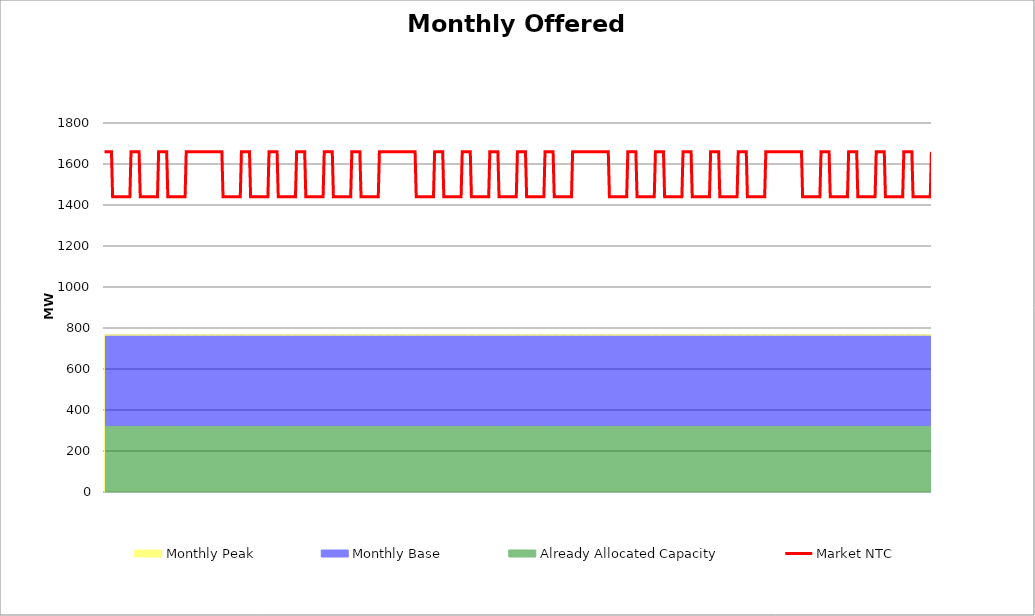
| Category | Market NTC |
|---|---|
| 0 | 1660 |
| 1 | 1660 |
| 2 | 1660 |
| 3 | 1660 |
| 4 | 1660 |
| 5 | 1660 |
| 6 | 1660 |
| 7 | 1440 |
| 8 | 1440 |
| 9 | 1440 |
| 10 | 1440 |
| 11 | 1440 |
| 12 | 1440 |
| 13 | 1440 |
| 14 | 1440 |
| 15 | 1440 |
| 16 | 1440 |
| 17 | 1440 |
| 18 | 1440 |
| 19 | 1440 |
| 20 | 1440 |
| 21 | 1440 |
| 22 | 1440 |
| 23 | 1660 |
| 24 | 1660 |
| 25 | 1660 |
| 26 | 1660 |
| 27 | 1660 |
| 28 | 1660 |
| 29 | 1660 |
| 30 | 1660 |
| 31 | 1440 |
| 32 | 1440 |
| 33 | 1440 |
| 34 | 1440 |
| 35 | 1440 |
| 36 | 1440 |
| 37 | 1440 |
| 38 | 1440 |
| 39 | 1440 |
| 40 | 1440 |
| 41 | 1440 |
| 42 | 1440 |
| 43 | 1440 |
| 44 | 1440 |
| 45 | 1440 |
| 46 | 1440 |
| 47 | 1660 |
| 48 | 1660 |
| 49 | 1660 |
| 50 | 1660 |
| 51 | 1660 |
| 52 | 1660 |
| 53 | 1660 |
| 54 | 1660 |
| 55 | 1440 |
| 56 | 1440 |
| 57 | 1440 |
| 58 | 1440 |
| 59 | 1440 |
| 60 | 1440 |
| 61 | 1440 |
| 62 | 1440 |
| 63 | 1440 |
| 64 | 1440 |
| 65 | 1440 |
| 66 | 1440 |
| 67 | 1440 |
| 68 | 1440 |
| 69 | 1440 |
| 70 | 1440 |
| 71 | 1660 |
| 72 | 1660 |
| 73 | 1660 |
| 74 | 1660 |
| 75 | 1660 |
| 76 | 1660 |
| 77 | 1660 |
| 78 | 1660 |
| 79 | 1660 |
| 80 | 1660 |
| 81 | 1660 |
| 82 | 1660 |
| 83 | 1660 |
| 84 | 1660 |
| 85 | 1660 |
| 86 | 1660 |
| 87 | 1660 |
| 88 | 1660 |
| 89 | 1660 |
| 90 | 1660 |
| 91 | 1660 |
| 92 | 1660 |
| 93 | 1660 |
| 94 | 1660 |
| 95 | 1660 |
| 96 | 1660 |
| 97 | 1660 |
| 98 | 1660 |
| 99 | 1660 |
| 100 | 1660 |
| 101 | 1660 |
| 102 | 1660 |
| 103 | 1440 |
| 104 | 1440 |
| 105 | 1440 |
| 106 | 1440 |
| 107 | 1440 |
| 108 | 1440 |
| 109 | 1440 |
| 110 | 1440 |
| 111 | 1440 |
| 112 | 1440 |
| 113 | 1440 |
| 114 | 1440 |
| 115 | 1440 |
| 116 | 1440 |
| 117 | 1440 |
| 118 | 1440 |
| 119 | 1660 |
| 120 | 1660 |
| 121 | 1660 |
| 122 | 1660 |
| 123 | 1660 |
| 124 | 1660 |
| 125 | 1660 |
| 126 | 1660 |
| 127 | 1440 |
| 128 | 1440 |
| 129 | 1440 |
| 130 | 1440 |
| 131 | 1440 |
| 132 | 1440 |
| 133 | 1440 |
| 134 | 1440 |
| 135 | 1440 |
| 136 | 1440 |
| 137 | 1440 |
| 138 | 1440 |
| 139 | 1440 |
| 140 | 1440 |
| 141 | 1440 |
| 142 | 1440 |
| 143 | 1660 |
| 144 | 1660 |
| 145 | 1660 |
| 146 | 1660 |
| 147 | 1660 |
| 148 | 1660 |
| 149 | 1660 |
| 150 | 1660 |
| 151 | 1440 |
| 152 | 1440 |
| 153 | 1440 |
| 154 | 1440 |
| 155 | 1440 |
| 156 | 1440 |
| 157 | 1440 |
| 158 | 1440 |
| 159 | 1440 |
| 160 | 1440 |
| 161 | 1440 |
| 162 | 1440 |
| 163 | 1440 |
| 164 | 1440 |
| 165 | 1440 |
| 166 | 1440 |
| 167 | 1660 |
| 168 | 1660 |
| 169 | 1660 |
| 170 | 1660 |
| 171 | 1660 |
| 172 | 1660 |
| 173 | 1660 |
| 174 | 1660 |
| 175 | 1440 |
| 176 | 1440 |
| 177 | 1440 |
| 178 | 1440 |
| 179 | 1440 |
| 180 | 1440 |
| 181 | 1440 |
| 182 | 1440 |
| 183 | 1440 |
| 184 | 1440 |
| 185 | 1440 |
| 186 | 1440 |
| 187 | 1440 |
| 188 | 1440 |
| 189 | 1440 |
| 190 | 1440 |
| 191 | 1660 |
| 192 | 1660 |
| 193 | 1660 |
| 194 | 1660 |
| 195 | 1660 |
| 196 | 1660 |
| 197 | 1660 |
| 198 | 1660 |
| 199 | 1440 |
| 200 | 1440 |
| 201 | 1440 |
| 202 | 1440 |
| 203 | 1440 |
| 204 | 1440 |
| 205 | 1440 |
| 206 | 1440 |
| 207 | 1440 |
| 208 | 1440 |
| 209 | 1440 |
| 210 | 1440 |
| 211 | 1440 |
| 212 | 1440 |
| 213 | 1440 |
| 214 | 1440 |
| 215 | 1660 |
| 216 | 1660 |
| 217 | 1660 |
| 218 | 1660 |
| 219 | 1660 |
| 220 | 1660 |
| 221 | 1660 |
| 222 | 1660 |
| 223 | 1440 |
| 224 | 1440 |
| 225 | 1440 |
| 226 | 1440 |
| 227 | 1440 |
| 228 | 1440 |
| 229 | 1440 |
| 230 | 1440 |
| 231 | 1440 |
| 232 | 1440 |
| 233 | 1440 |
| 234 | 1440 |
| 235 | 1440 |
| 236 | 1440 |
| 237 | 1440 |
| 238 | 1440 |
| 239 | 1660 |
| 240 | 1660 |
| 241 | 1660 |
| 242 | 1660 |
| 243 | 1660 |
| 244 | 1660 |
| 245 | 1660 |
| 246 | 1660 |
| 247 | 1660 |
| 248 | 1660 |
| 249 | 1660 |
| 250 | 1660 |
| 251 | 1660 |
| 252 | 1660 |
| 253 | 1660 |
| 254 | 1660 |
| 255 | 1660 |
| 256 | 1660 |
| 257 | 1660 |
| 258 | 1660 |
| 259 | 1660 |
| 260 | 1660 |
| 261 | 1660 |
| 262 | 1660 |
| 263 | 1660 |
| 264 | 1660 |
| 265 | 1660 |
| 266 | 1660 |
| 267 | 1660 |
| 268 | 1660 |
| 269 | 1660 |
| 270 | 1660 |
| 271 | 1440 |
| 272 | 1440 |
| 273 | 1440 |
| 274 | 1440 |
| 275 | 1440 |
| 276 | 1440 |
| 277 | 1440 |
| 278 | 1440 |
| 279 | 1440 |
| 280 | 1440 |
| 281 | 1440 |
| 282 | 1440 |
| 283 | 1440 |
| 284 | 1440 |
| 285 | 1440 |
| 286 | 1440 |
| 287 | 1660 |
| 288 | 1660 |
| 289 | 1660 |
| 290 | 1660 |
| 291 | 1660 |
| 292 | 1660 |
| 293 | 1660 |
| 294 | 1660 |
| 295 | 1440 |
| 296 | 1440 |
| 297 | 1440 |
| 298 | 1440 |
| 299 | 1440 |
| 300 | 1440 |
| 301 | 1440 |
| 302 | 1440 |
| 303 | 1440 |
| 304 | 1440 |
| 305 | 1440 |
| 306 | 1440 |
| 307 | 1440 |
| 308 | 1440 |
| 309 | 1440 |
| 310 | 1440 |
| 311 | 1660 |
| 312 | 1660 |
| 313 | 1660 |
| 314 | 1660 |
| 315 | 1660 |
| 316 | 1660 |
| 317 | 1660 |
| 318 | 1660 |
| 319 | 1440 |
| 320 | 1440 |
| 321 | 1440 |
| 322 | 1440 |
| 323 | 1440 |
| 324 | 1440 |
| 325 | 1440 |
| 326 | 1440 |
| 327 | 1440 |
| 328 | 1440 |
| 329 | 1440 |
| 330 | 1440 |
| 331 | 1440 |
| 332 | 1440 |
| 333 | 1440 |
| 334 | 1440 |
| 335 | 1660 |
| 336 | 1660 |
| 337 | 1660 |
| 338 | 1660 |
| 339 | 1660 |
| 340 | 1660 |
| 341 | 1660 |
| 342 | 1660 |
| 343 | 1440 |
| 344 | 1440 |
| 345 | 1440 |
| 346 | 1440 |
| 347 | 1440 |
| 348 | 1440 |
| 349 | 1440 |
| 350 | 1440 |
| 351 | 1440 |
| 352 | 1440 |
| 353 | 1440 |
| 354 | 1440 |
| 355 | 1440 |
| 356 | 1440 |
| 357 | 1440 |
| 358 | 1440 |
| 359 | 1660 |
| 360 | 1660 |
| 361 | 1660 |
| 362 | 1660 |
| 363 | 1660 |
| 364 | 1660 |
| 365 | 1660 |
| 366 | 1660 |
| 367 | 1440 |
| 368 | 1440 |
| 369 | 1440 |
| 370 | 1440 |
| 371 | 1440 |
| 372 | 1440 |
| 373 | 1440 |
| 374 | 1440 |
| 375 | 1440 |
| 376 | 1440 |
| 377 | 1440 |
| 378 | 1440 |
| 379 | 1440 |
| 380 | 1440 |
| 381 | 1440 |
| 382 | 1440 |
| 383 | 1660 |
| 384 | 1660 |
| 385 | 1660 |
| 386 | 1660 |
| 387 | 1660 |
| 388 | 1660 |
| 389 | 1660 |
| 390 | 1660 |
| 391 | 1440 |
| 392 | 1440 |
| 393 | 1440 |
| 394 | 1440 |
| 395 | 1440 |
| 396 | 1440 |
| 397 | 1440 |
| 398 | 1440 |
| 399 | 1440 |
| 400 | 1440 |
| 401 | 1440 |
| 402 | 1440 |
| 403 | 1440 |
| 404 | 1440 |
| 405 | 1440 |
| 406 | 1440 |
| 407 | 1660 |
| 408 | 1660 |
| 409 | 1660 |
| 410 | 1660 |
| 411 | 1660 |
| 412 | 1660 |
| 413 | 1660 |
| 414 | 1660 |
| 415 | 1660 |
| 416 | 1660 |
| 417 | 1660 |
| 418 | 1660 |
| 419 | 1660 |
| 420 | 1660 |
| 421 | 1660 |
| 422 | 1660 |
| 423 | 1660 |
| 424 | 1660 |
| 425 | 1660 |
| 426 | 1660 |
| 427 | 1660 |
| 428 | 1660 |
| 429 | 1660 |
| 430 | 1660 |
| 431 | 1660 |
| 432 | 1660 |
| 433 | 1660 |
| 434 | 1660 |
| 435 | 1660 |
| 436 | 1660 |
| 437 | 1660 |
| 438 | 1660 |
| 439 | 1440 |
| 440 | 1440 |
| 441 | 1440 |
| 442 | 1440 |
| 443 | 1440 |
| 444 | 1440 |
| 445 | 1440 |
| 446 | 1440 |
| 447 | 1440 |
| 448 | 1440 |
| 449 | 1440 |
| 450 | 1440 |
| 451 | 1440 |
| 452 | 1440 |
| 453 | 1440 |
| 454 | 1440 |
| 455 | 1660 |
| 456 | 1660 |
| 457 | 1660 |
| 458 | 1660 |
| 459 | 1660 |
| 460 | 1660 |
| 461 | 1660 |
| 462 | 1660 |
| 463 | 1440 |
| 464 | 1440 |
| 465 | 1440 |
| 466 | 1440 |
| 467 | 1440 |
| 468 | 1440 |
| 469 | 1440 |
| 470 | 1440 |
| 471 | 1440 |
| 472 | 1440 |
| 473 | 1440 |
| 474 | 1440 |
| 475 | 1440 |
| 476 | 1440 |
| 477 | 1440 |
| 478 | 1440 |
| 479 | 1660 |
| 480 | 1660 |
| 481 | 1660 |
| 482 | 1660 |
| 483 | 1660 |
| 484 | 1660 |
| 485 | 1660 |
| 486 | 1660 |
| 487 | 1440 |
| 488 | 1440 |
| 489 | 1440 |
| 490 | 1440 |
| 491 | 1440 |
| 492 | 1440 |
| 493 | 1440 |
| 494 | 1440 |
| 495 | 1440 |
| 496 | 1440 |
| 497 | 1440 |
| 498 | 1440 |
| 499 | 1440 |
| 500 | 1440 |
| 501 | 1440 |
| 502 | 1440 |
| 503 | 1660 |
| 504 | 1660 |
| 505 | 1660 |
| 506 | 1660 |
| 507 | 1660 |
| 508 | 1660 |
| 509 | 1660 |
| 510 | 1660 |
| 511 | 1440 |
| 512 | 1440 |
| 513 | 1440 |
| 514 | 1440 |
| 515 | 1440 |
| 516 | 1440 |
| 517 | 1440 |
| 518 | 1440 |
| 519 | 1440 |
| 520 | 1440 |
| 521 | 1440 |
| 522 | 1440 |
| 523 | 1440 |
| 524 | 1440 |
| 525 | 1440 |
| 526 | 1440 |
| 527 | 1660 |
| 528 | 1660 |
| 529 | 1660 |
| 530 | 1660 |
| 531 | 1660 |
| 532 | 1660 |
| 533 | 1660 |
| 534 | 1660 |
| 535 | 1440 |
| 536 | 1440 |
| 537 | 1440 |
| 538 | 1440 |
| 539 | 1440 |
| 540 | 1440 |
| 541 | 1440 |
| 542 | 1440 |
| 543 | 1440 |
| 544 | 1440 |
| 545 | 1440 |
| 546 | 1440 |
| 547 | 1440 |
| 548 | 1440 |
| 549 | 1440 |
| 550 | 1440 |
| 551 | 1660 |
| 552 | 1660 |
| 553 | 1660 |
| 554 | 1660 |
| 555 | 1660 |
| 556 | 1660 |
| 557 | 1660 |
| 558 | 1660 |
| 559 | 1440 |
| 560 | 1440 |
| 561 | 1440 |
| 562 | 1440 |
| 563 | 1440 |
| 564 | 1440 |
| 565 | 1440 |
| 566 | 1440 |
| 567 | 1440 |
| 568 | 1440 |
| 569 | 1440 |
| 570 | 1440 |
| 571 | 1440 |
| 572 | 1440 |
| 573 | 1440 |
| 574 | 1440 |
| 575 | 1660 |
| 576 | 1660 |
| 577 | 1660 |
| 578 | 1660 |
| 579 | 1660 |
| 580 | 1660 |
| 581 | 1660 |
| 582 | 1660 |
| 583 | 1660 |
| 584 | 1660 |
| 585 | 1660 |
| 586 | 1660 |
| 587 | 1660 |
| 588 | 1660 |
| 589 | 1660 |
| 590 | 1660 |
| 591 | 1660 |
| 592 | 1660 |
| 593 | 1660 |
| 594 | 1660 |
| 595 | 1660 |
| 596 | 1660 |
| 597 | 1660 |
| 598 | 1660 |
| 599 | 1660 |
| 600 | 1660 |
| 601 | 1660 |
| 602 | 1660 |
| 603 | 1660 |
| 604 | 1660 |
| 605 | 1660 |
| 606 | 1660 |
| 607 | 1440 |
| 608 | 1440 |
| 609 | 1440 |
| 610 | 1440 |
| 611 | 1440 |
| 612 | 1440 |
| 613 | 1440 |
| 614 | 1440 |
| 615 | 1440 |
| 616 | 1440 |
| 617 | 1440 |
| 618 | 1440 |
| 619 | 1440 |
| 620 | 1440 |
| 621 | 1440 |
| 622 | 1440 |
| 623 | 1660 |
| 624 | 1660 |
| 625 | 1660 |
| 626 | 1660 |
| 627 | 1660 |
| 628 | 1660 |
| 629 | 1660 |
| 630 | 1660 |
| 631 | 1440 |
| 632 | 1440 |
| 633 | 1440 |
| 634 | 1440 |
| 635 | 1440 |
| 636 | 1440 |
| 637 | 1440 |
| 638 | 1440 |
| 639 | 1440 |
| 640 | 1440 |
| 641 | 1440 |
| 642 | 1440 |
| 643 | 1440 |
| 644 | 1440 |
| 645 | 1440 |
| 646 | 1440 |
| 647 | 1660 |
| 648 | 1660 |
| 649 | 1660 |
| 650 | 1660 |
| 651 | 1660 |
| 652 | 1660 |
| 653 | 1660 |
| 654 | 1660 |
| 655 | 1440 |
| 656 | 1440 |
| 657 | 1440 |
| 658 | 1440 |
| 659 | 1440 |
| 660 | 1440 |
| 661 | 1440 |
| 662 | 1440 |
| 663 | 1440 |
| 664 | 1440 |
| 665 | 1440 |
| 666 | 1440 |
| 667 | 1440 |
| 668 | 1440 |
| 669 | 1440 |
| 670 | 1440 |
| 671 | 1660 |
| 672 | 1660 |
| 673 | 1660 |
| 674 | 1660 |
| 675 | 1660 |
| 676 | 1660 |
| 677 | 1660 |
| 678 | 1660 |
| 679 | 1440 |
| 680 | 1440 |
| 681 | 1440 |
| 682 | 1440 |
| 683 | 1440 |
| 684 | 1440 |
| 685 | 1440 |
| 686 | 1440 |
| 687 | 1440 |
| 688 | 1440 |
| 689 | 1440 |
| 690 | 1440 |
| 691 | 1440 |
| 692 | 1440 |
| 693 | 1440 |
| 694 | 1440 |
| 695 | 1660 |
| 696 | 1660 |
| 697 | 1660 |
| 698 | 1660 |
| 699 | 1660 |
| 700 | 1660 |
| 701 | 1660 |
| 702 | 1660 |
| 703 | 1440 |
| 704 | 1440 |
| 705 | 1440 |
| 706 | 1440 |
| 707 | 1440 |
| 708 | 1440 |
| 709 | 1440 |
| 710 | 1440 |
| 711 | 1440 |
| 712 | 1440 |
| 713 | 1440 |
| 714 | 1440 |
| 715 | 1440 |
| 716 | 1440 |
| 717 | 1440 |
| 718 | 1440 |
| 719 | 1660 |